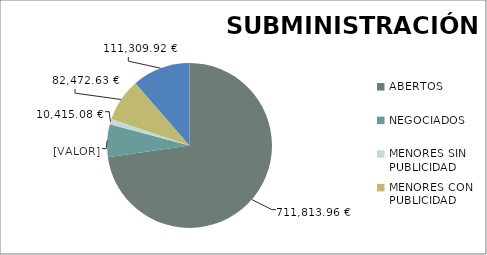
| Category | Series 0 |
|---|---|
| ABERTOS  | 711813.96 |
| NEGOCIADOS  | 62617.6 |
| MENORES SIN PUBLICIDAD | 10415.08 |
| MENORES CON PUBLICIDAD | 82472.63 |
| PROCEDEMENTO SIMPLIFICADO | 111309.92 |